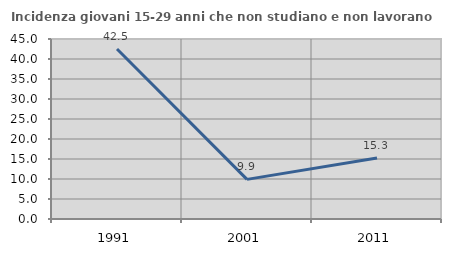
| Category | Incidenza giovani 15-29 anni che non studiano e non lavorano  |
|---|---|
| 1991.0 | 42.489 |
| 2001.0 | 9.905 |
| 2011.0 | 15.268 |